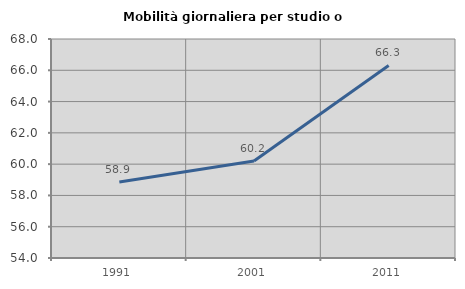
| Category | Mobilità giornaliera per studio o lavoro |
|---|---|
| 1991.0 | 58.852 |
| 2001.0 | 60.199 |
| 2011.0 | 66.306 |